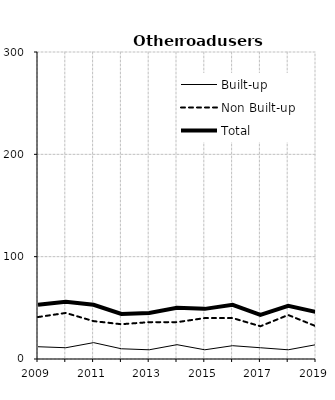
| Category | Built-up | Non Built-up | Total |
|---|---|---|---|
| 2009.0 | 12 | 41 | 53 |
| 2010.0 | 11 | 45 | 56 |
| 2011.0 | 16 | 37 | 53 |
| 2012.0 | 10 | 34 | 44 |
| 2013.0 | 9 | 36 | 45 |
| 2014.0 | 14 | 36 | 50 |
| 2015.0 | 9 | 40 | 49 |
| 2016.0 | 13 | 40 | 53 |
| 2017.0 | 11 | 32 | 43 |
| 2018.0 | 9 | 43 | 52 |
| 2019.0 | 14 | 32 | 46 |